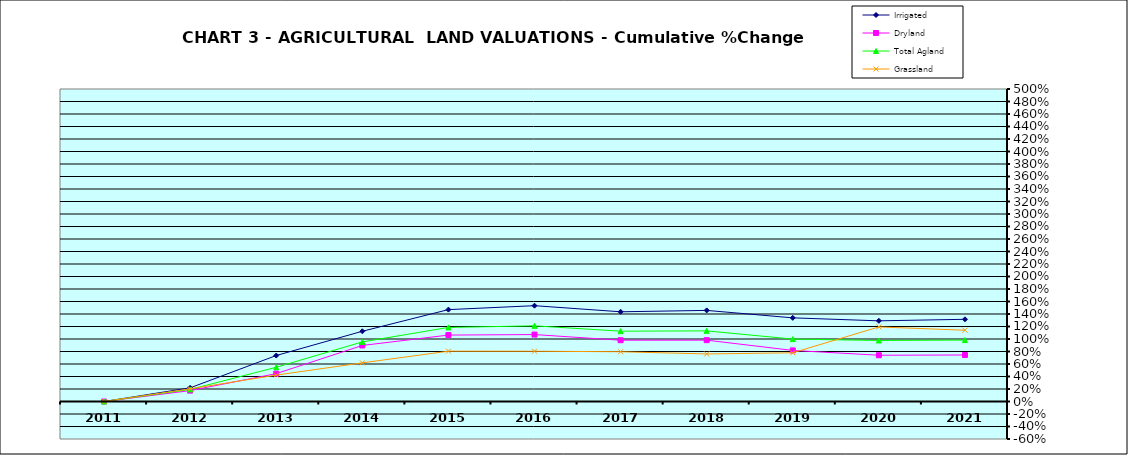
| Category | Irrigated | Dryland | Total Agland | Grassland |
|---|---|---|---|---|
| 2011.0 | 0 | 0 | 0 | 0 |
| 2012.0 | 0.218 | 0.174 | 0.193 | 0.203 |
| 2013.0 | 0.736 | 0.446 | 0.547 | 0.422 |
| 2014.0 | 1.124 | 0.897 | 0.953 | 0.618 |
| 2015.0 | 1.47 | 1.063 | 1.185 | 0.805 |
| 2016.0 | 1.533 | 1.071 | 1.211 | 0.804 |
| 2017.0 | 1.435 | 0.981 | 1.125 | 0.796 |
| 2018.0 | 1.458 | 0.982 | 1.13 | 0.761 |
| 2019.0 | 1.338 | 0.817 | 0.999 | 0.779 |
| 2020.0 | 1.291 | 0.74 | 0.976 | 1.193 |
| 2021.0 | 1.315 | 0.744 | 0.983 | 1.14 |